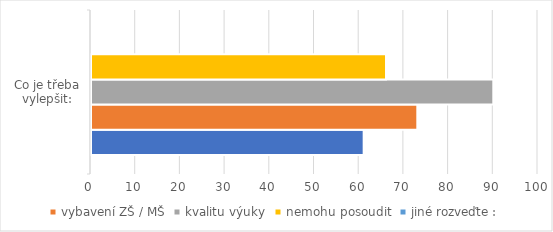
| Category | technický stav budov | vybavení ZŠ / MŠ | kvalitu výuky | nemohu posoudit | jiné rozveďte : |
|---|---|---|---|---|---|
| 0 | 61 | 73 | 90 | 66 | 0 |